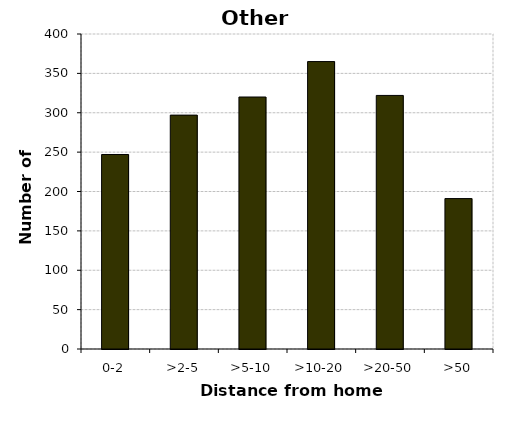
| Category | Other vehicles |
|---|---|
| 0-2 | 247 |
| >2-5 | 297 |
| >5-10 | 320 |
| >10-20 | 365 |
| >20-50 | 322 |
| >50 | 191 |